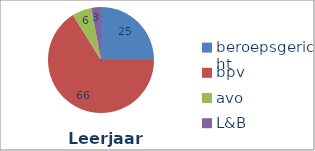
| Category | Series 0 |
|---|---|
| beroepsgericht | 24.977 |
| bpv | 66.116 |
| avo | 5.969 |
| L&B | 2.938 |